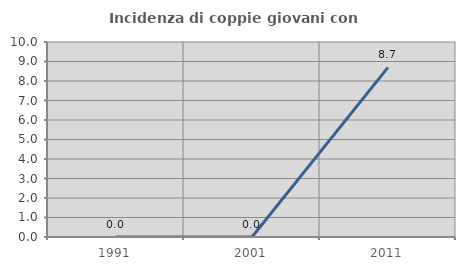
| Category | Incidenza di coppie giovani con figli |
|---|---|
| 1991.0 | 0 |
| 2001.0 | 0 |
| 2011.0 | 8.696 |